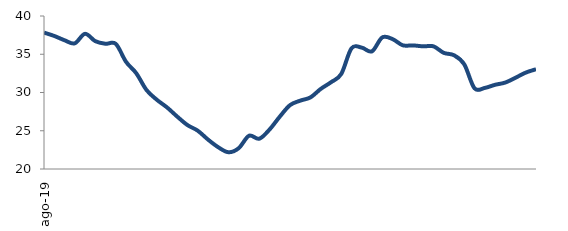
| Category | Series 0 |
|---|---|
| 2019-08-01 | 37.831 |
| 2019-09-01 | 37.39 |
| 2019-10-01 | 36.831 |
| 2019-11-01 | 36.425 |
| 2019-12-01 | 37.671 |
| 2020-01-01 | 36.714 |
| 2020-02-01 | 36.369 |
| 2020-03-01 | 36.361 |
| 2020-04-01 | 34.017 |
| 2020-05-01 | 32.52 |
| 2020-06-01 | 30.328 |
| 2020-07-01 | 29.058 |
| 2020-08-01 | 28.052 |
| 2020-09-01 | 26.848 |
| 2020-10-01 | 25.737 |
| 2020-11-01 | 25.008 |
| 2020-12-01 | 23.848 |
| 2021-01-01 | 22.846 |
| 2021-02-01 | 22.188 |
| 2021-03-01 | 22.726 |
| 2021-04-01 | 24.345 |
| 2021-05-01 | 23.958 |
| 2021-06-01 | 25.156 |
| 2021-07-01 | 26.838 |
| 2021-08-01 | 28.346 |
| 2021-09-01 | 28.934 |
| 2021-10-01 | 29.363 |
| 2021-11-01 | 30.47 |
| 2021-12-01 | 31.341 |
| 2022-01-01 | 32.424 |
| 2022-02-01 | 35.771 |
| 2022-03-01 | 35.868 |
| 2022-04-01 | 35.381 |
| 2022-05-01 | 37.2 |
| 2022-06-01 | 36.986 |
| 2022-07-01 | 36.172 |
| 2022-08-01 | 36.157 |
| 2022-09-01 | 36.033 |
| 2022-10-01 | 36.034 |
| 2022-11-01 | 35.183 |
| 2022-12-01 | 34.87 |
| 2023-01-01 | 33.684 |
| 2023-02-01 | 30.55 |
| 2023-03-01 | 30.596 |
| 2023-04-01 | 31.004 |
| 2023-05-01 | 31.3 |
| 2023-06-01 | 31.93 |
| 2023-07-01 | 32.601 |
| 2023-08-01 | 33.043 |